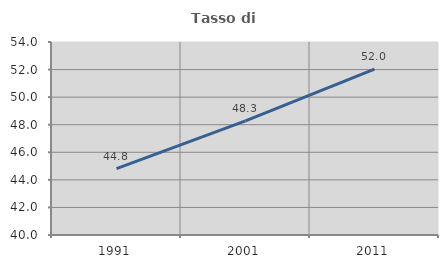
| Category | Tasso di occupazione   |
|---|---|
| 1991.0 | 44.819 |
| 2001.0 | 48.278 |
| 2011.0 | 52.039 |